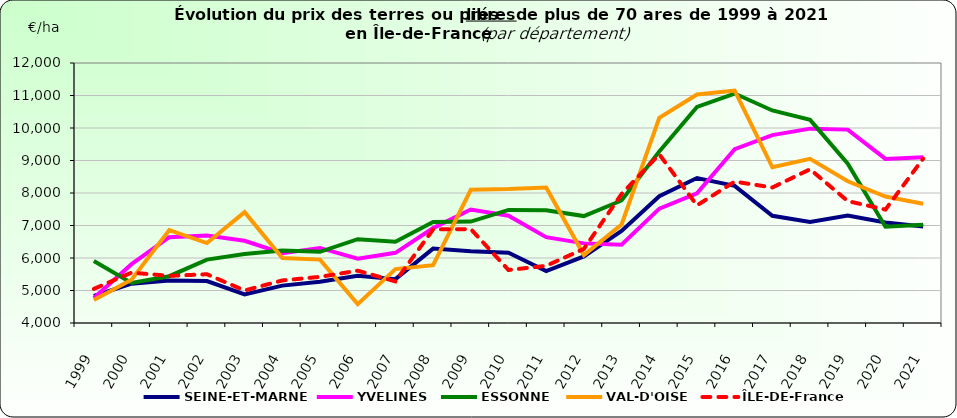
| Category | SEINE-ET-MARNE | YVELINES | ESSONNE | VAL-D'OISE | ÎLE-DE-France |
|---|---|---|---|---|---|
| 1999 | 4830 | 4770 | 5910 | 4710 | 5050 |
| 2000 | 5210 | 5810 | 5230 | 5330 | 5550 |
| 2001 | 5310 | 6640 | 5440 | 6860 | 5450 |
| 2002 | 5290 | 6690 | 5950 | 6460 | 5500 |
| 2003 | 4880 | 6530 | 6120 | 7410 | 5000 |
| 2004 | 5150 | 6150 | 6230 | 6000 | 5310 |
| 2005 | 5270 | 6310 | 6190 | 5950 | 5420 |
| 2006 | 5450 | 5980 | 6580 | 4580 | 5610 |
| 2007 | 5350 | 6160 | 6500 | 5660 | 5280 |
| 2008 | 6290 | 6920 | 7110 | 5780 | 6880 |
| 2009 | 6210 | 7490 | 7120 | 8100 | 6890 |
| 2010 | 6160 | 7300 | 7480 | 8120 | 5630 |
| 2011 | 5600 | 6640 | 7470 | 8170 | 5760 |
| 2012 | 6050 | 6450 | 7290 | 6090 | 6280 |
| 2013 | 6830 | 6410 | 7770 | 7030 | 7970 |
| 2014 | 7900 | 7520 | 9280 | 10310 | 9190 |
| 2015 | 8460 | 7990 | 10650 | 11030 | 7620 |
| 2016 | 8220 | 9350 | 11060 | 11150 | 8350 |
| 2017 | 7300 | 9780 | 10540 | 8790 | 8170 |
| 2018 | 7110 | 9980 | 10250 | 9050 | 8730 |
| 2019 | 7310 | 9950 | 8900 | 8360 | 7750 |
| 2020 | 7090 | 9050 | 6960 | 7890 | 7490 |
| 2021 | 6970 | 9100 | 7020 | 7670 | 9060 |